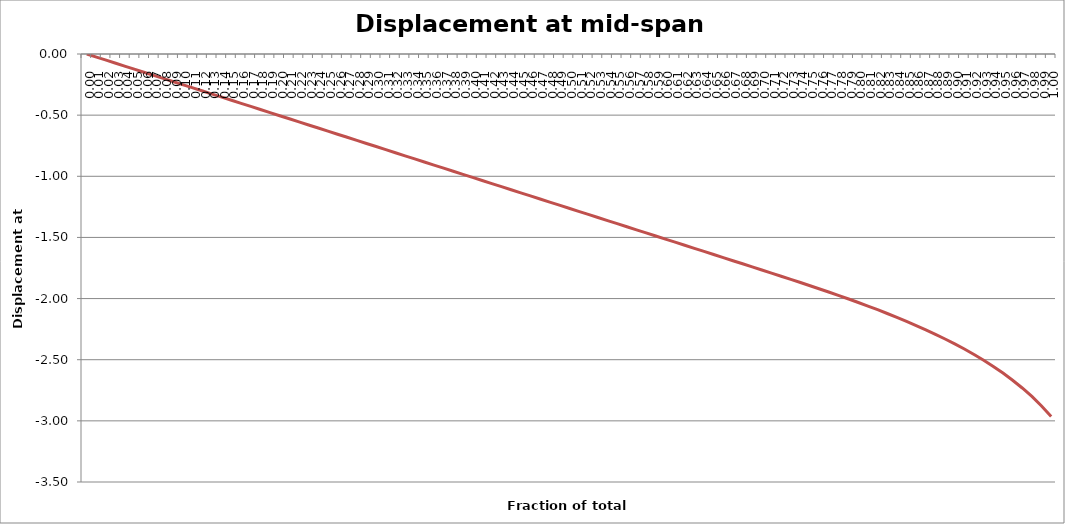
| Category | Displacement at mid-span [mm] |
|---|---|
| 0.0 | 0 |
| 0.01 | -0.025 |
| 0.02 | -0.05 |
| 0.03 | -0.076 |
| 0.04 | -0.101 |
| 0.05 | -0.126 |
| 0.06 | -0.151 |
| 0.06999999999999999 | -0.177 |
| 0.08 | -0.202 |
| 0.09 | -0.227 |
| 0.1 | -0.252 |
| 0.11000000000000001 | -0.278 |
| 0.12 | -0.303 |
| 0.13 | -0.328 |
| 0.13999999999999999 | -0.353 |
| 0.15 | -0.378 |
| 0.16 | -0.404 |
| 0.16999999999999998 | -0.429 |
| 0.18 | -0.454 |
| 0.19 | -0.479 |
| 0.2 | -0.505 |
| 0.21000000000000002 | -0.53 |
| 0.22000000000000003 | -0.555 |
| 0.22999999999999998 | -0.58 |
| 0.24 | -0.605 |
| 0.25 | -0.631 |
| 0.26 | -0.656 |
| 0.27 | -0.681 |
| 0.27999999999999997 | -0.706 |
| 0.29 | -0.732 |
| 0.3 | -0.757 |
| 0.31 | -0.782 |
| 0.32 | -0.807 |
| 0.32999999999999996 | -0.833 |
| 0.33999999999999997 | -0.858 |
| 0.35 | -0.883 |
| 0.36 | -0.908 |
| 0.37 | -0.933 |
| 0.38 | -0.959 |
| 0.39 | -0.984 |
| 0.4 | -1.009 |
| 0.41 | -1.034 |
| 0.42000000000000004 | -1.06 |
| 0.43 | -1.085 |
| 0.44000000000000006 | -1.11 |
| 0.45 | -1.135 |
| 0.45999999999999996 | -1.16 |
| 0.47000000000000003 | -1.186 |
| 0.48 | -1.211 |
| 0.49000000000000005 | -1.236 |
| 0.5 | -1.261 |
| 0.51 | -1.287 |
| 0.52 | -1.312 |
| 0.53 | -1.337 |
| 0.54 | -1.362 |
| 0.55 | -1.388 |
| 0.5599999999999999 | -1.413 |
| 0.5700000000000001 | -1.438 |
| 0.58 | -1.463 |
| 0.5900000000000001 | -1.488 |
| 0.6 | -1.514 |
| 0.61 | -1.539 |
| 0.62 | -1.564 |
| 0.63 | -1.589 |
| 0.64 | -1.615 |
| 0.65 | -1.64 |
| 0.6599999999999999 | -1.665 |
| 0.67 | -1.69 |
| 0.6799999999999999 | -1.716 |
| 0.6900000000000001 | -1.741 |
| 0.7 | -1.766 |
| 0.71 | -1.792 |
| 0.72 | -1.817 |
| 0.73 | -1.843 |
| 0.74 | -1.869 |
| 0.75 | -1.895 |
| 0.76 | -1.921 |
| 0.77 | -1.948 |
| 0.78 | -1.976 |
| 0.79 | -2.004 |
| 0.8 | -2.032 |
| 0.8099999999999999 | -2.061 |
| 0.82 | -2.091 |
| 0.8300000000000001 | -2.122 |
| 0.8400000000000001 | -2.154 |
| 0.85 | -2.186 |
| 0.86 | -2.22 |
| 0.8699999999999999 | -2.256 |
| 0.8800000000000001 | -2.292 |
| 0.89 | -2.33 |
| 0.9 | -2.371 |
| 0.9099999999999999 | -2.412 |
| 0.9199999999999999 | -2.458 |
| 0.93 | -2.504 |
| 0.9400000000000001 | -2.555 |
| 0.95 | -2.609 |
| 0.96 | -2.668 |
| 0.97 | -2.731 |
| 0.9800000000000001 | -2.8 |
| 0.99 | -2.878 |
| 1.0 | -2.964 |